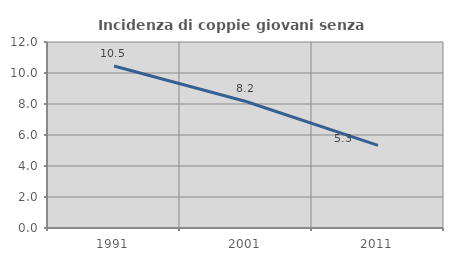
| Category | Incidenza di coppie giovani senza figli |
|---|---|
| 1991.0 | 10.455 |
| 2001.0 | 8.163 |
| 2011.0 | 5.328 |